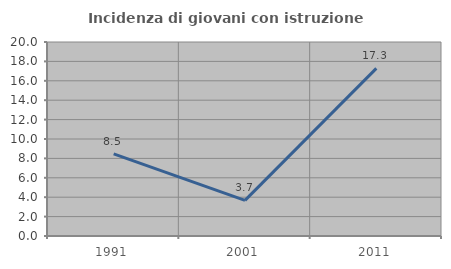
| Category | Incidenza di giovani con istruzione universitaria |
|---|---|
| 1991.0 | 8.462 |
| 2001.0 | 3.676 |
| 2011.0 | 17.284 |